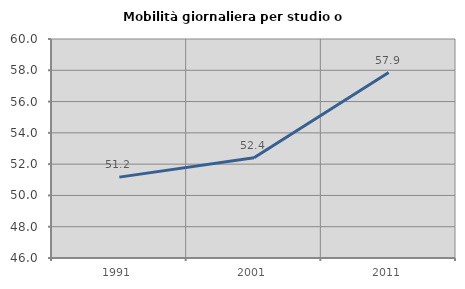
| Category | Mobilità giornaliera per studio o lavoro |
|---|---|
| 1991.0 | 51.17 |
| 2001.0 | 52.405 |
| 2011.0 | 57.858 |